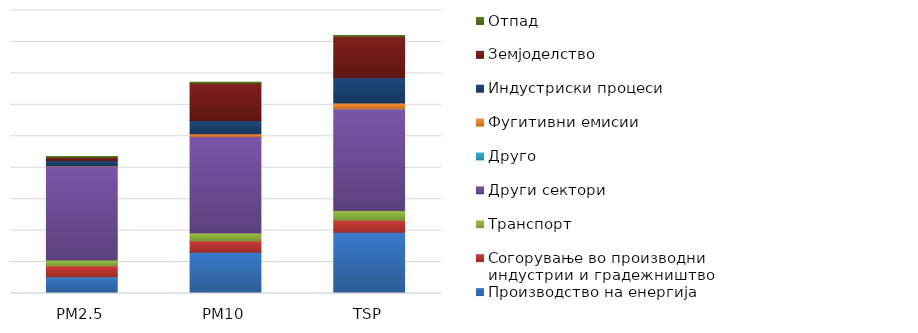
| Category | Производство на енергија | Согорување во производни индустрии и градежништво | Транспорт | Други сектори | Друго | Фугитивни емисии | Индустриски процеси | Земјоделство | Отпад |
|---|---|---|---|---|---|---|---|---|---|
| PM2.5 | 1.066 | 0.693 | 0.367 | 5.974 | 0.001 | 0.027 | 0.324 | 0.202 | 0.054 |
| PM10 | 2.632 | 0.731 | 0.487 | 6.137 | 0.001 | 0.177 | 0.838 | 2.37 | 0.059 |
| TSP | 3.897 | 0.764 | 0.625 | 6.461 | 0.001 | 0.372 | 1.602 | 2.625 | 0.062 |